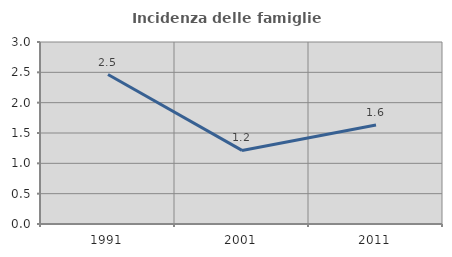
| Category | Incidenza delle famiglie numerose |
|---|---|
| 1991.0 | 2.464 |
| 2001.0 | 1.213 |
| 2011.0 | 1.633 |